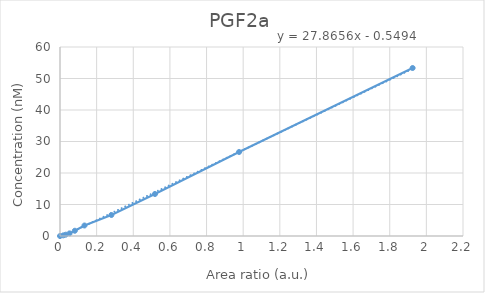
| Category | Series 0 |
|---|---|
| 0.0 | 0 |
| 0.0180612595678846 | 0.208 |
| 0.03134969528108 | 0.417 |
| 0.05201665990952 | 0.833 |
| 0.0808812926528651 | 1.667 |
| 0.133613464450704 | 3.333 |
| 0.280577680174136 | 6.667 |
| 0.518481804462828 | 13.333 |
| 0.977599884859734 | 26.667 |
| 1.9250040174038 | 53.333 |